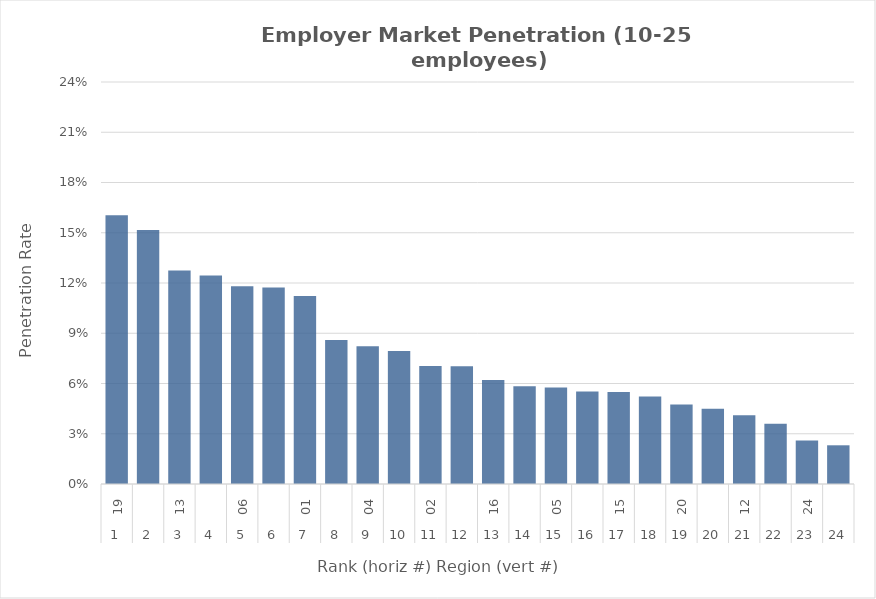
| Category | Rate |
|---|---|
| 0 | 0.16 |
| 1 | 0.152 |
| 2 | 0.127 |
| 3 | 0.125 |
| 4 | 0.118 |
| 5 | 0.117 |
| 6 | 0.112 |
| 7 | 0.086 |
| 8 | 0.082 |
| 9 | 0.079 |
| 10 | 0.07 |
| 11 | 0.07 |
| 12 | 0.062 |
| 13 | 0.058 |
| 14 | 0.058 |
| 15 | 0.055 |
| 16 | 0.055 |
| 17 | 0.052 |
| 18 | 0.047 |
| 19 | 0.045 |
| 20 | 0.041 |
| 21 | 0.036 |
| 22 | 0.026 |
| 23 | 0.023 |